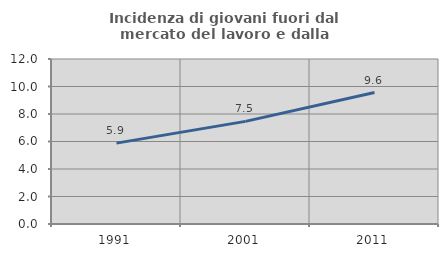
| Category | Incidenza di giovani fuori dal mercato del lavoro e dalla formazione  |
|---|---|
| 1991.0 | 5.882 |
| 2001.0 | 7.463 |
| 2011.0 | 9.559 |